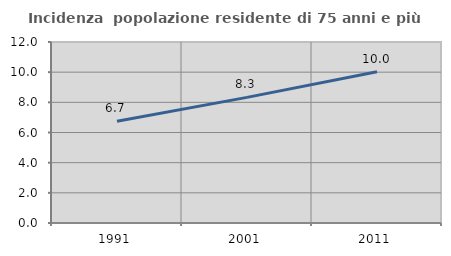
| Category | Incidenza  popolazione residente di 75 anni e più |
|---|---|
| 1991.0 | 6.747 |
| 2001.0 | 8.329 |
| 2011.0 | 10.032 |